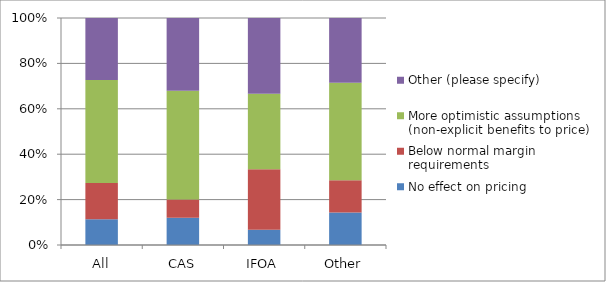
| Category | No effect on pricing | Below normal margin requirements | More optimistic assumptions (non-explicit benefits to price) | Other (please specify) |
|---|---|---|---|---|
| All | 0.114 | 0.159 | 0.455 | 0.273 |
| CAS | 0.12 | 0.08 | 0.48 | 0.32 |
| IFOA | 0.067 | 0.267 | 0.333 | 0.333 |
| Other | 0.143 | 0.143 | 0.429 | 0.286 |